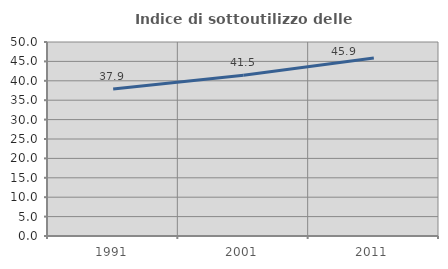
| Category | Indice di sottoutilizzo delle abitazioni  |
|---|---|
| 1991.0 | 37.893 |
| 2001.0 | 41.457 |
| 2011.0 | 45.876 |